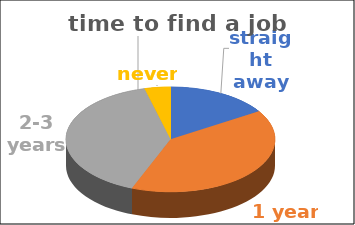
| Category | time to find a job | Series 1 | Series 2 | Series 3 | Series 4 |
|---|---|---|---|---|---|
| straight away | 0.16 |  |  |  |  |
| 1 year | 0.4 |  |  |  |  |
| 2-3 years | 0.4 |  |  |  |  |
| never | 0.04 |  |  |  |  |